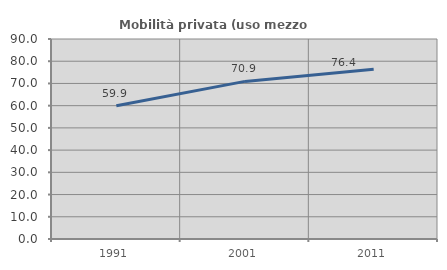
| Category | Mobilità privata (uso mezzo privato) |
|---|---|
| 1991.0 | 59.938 |
| 2001.0 | 70.922 |
| 2011.0 | 76.42 |